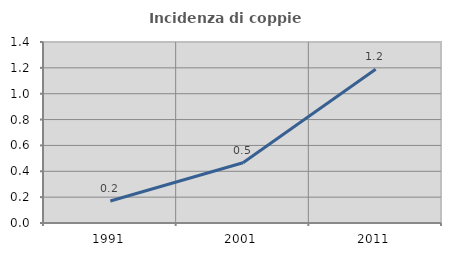
| Category | Incidenza di coppie miste |
|---|---|
| 1991.0 | 0.17 |
| 2001.0 | 0.466 |
| 2011.0 | 1.189 |